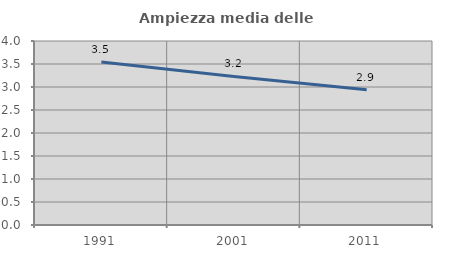
| Category | Ampiezza media delle famiglie |
|---|---|
| 1991.0 | 3.544 |
| 2001.0 | 3.229 |
| 2011.0 | 2.943 |